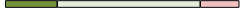
| Category | Series 0 | Series 1 | Series 2 | Series 3 |
|---|---|---|---|---|
| 0 | 4 | 11 | 3 | 0 |